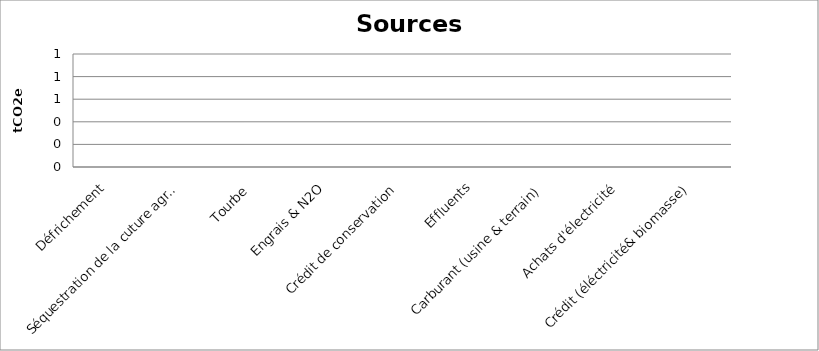
| Category | tCO2e |
|---|---|
| Défrichement | 0 |
| Séquestration de la cuture agricole | 0 |
| Tourbe  | 0 |
| Engrais & N2O | 0 |
| Crédit de conservation | 0 |
| Effluents | 0 |
| Carburant (usine & terrain) | 0 |
|  Achats d'électricité  | 0 |
| Crédit (éléctricité& biomasse) | 0 |